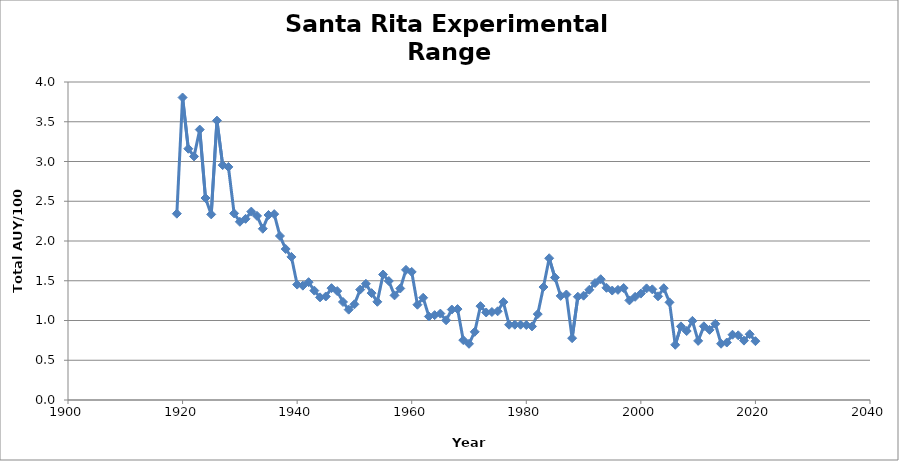
| Category | Series 0 |
|---|---|
| 1919.0 | 2.344 |
| 1920.0 | 3.805 |
| 1921.0 | 3.16 |
| 1922.0 | 3.064 |
| 1923.0 | 3.402 |
| 1924.0 | 2.541 |
| 1925.0 | 2.335 |
| 1926.0 | 3.514 |
| 1927.0 | 2.954 |
| 1928.0 | 2.932 |
| 1929.0 | 2.347 |
| 1930.0 | 2.242 |
| 1931.0 | 2.279 |
| 1932.0 | 2.37 |
| 1933.0 | 2.316 |
| 1934.0 | 2.154 |
| 1935.0 | 2.327 |
| 1936.0 | 2.338 |
| 1937.0 | 2.063 |
| 1938.0 | 1.899 |
| 1939.0 | 1.8 |
| 1940.0 | 1.452 |
| 1941.0 | 1.439 |
| 1942.0 | 1.482 |
| 1943.0 | 1.376 |
| 1944.0 | 1.291 |
| 1945.0 | 1.302 |
| 1946.0 | 1.407 |
| 1947.0 | 1.37 |
| 1948.0 | 1.233 |
| 1949.0 | 1.136 |
| 1950.0 | 1.204 |
| 1951.0 | 1.389 |
| 1952.0 | 1.462 |
| 1953.0 | 1.344 |
| 1954.0 | 1.235 |
| 1955.0 | 1.579 |
| 1956.0 | 1.497 |
| 1957.0 | 1.316 |
| 1958.0 | 1.403 |
| 1959.0 | 1.637 |
| 1960.0 | 1.611 |
| 1961.0 | 1.199 |
| 1962.0 | 1.286 |
| 1963.0 | 1.05 |
| 1964.0 | 1.067 |
| 1965.0 | 1.087 |
| 1966.0 | 1.003 |
| 1967.0 | 1.138 |
| 1968.0 | 1.144 |
| 1969.0 | 0.753 |
| 1970.0 | 0.707 |
| 1971.0 | 0.857 |
| 1972.0 | 1.181 |
| 1973.0 | 1.101 |
| 1974.0 | 1.107 |
| 1975.0 | 1.116 |
| 1976.0 | 1.231 |
| 1977.0 | 0.947 |
| 1978.0 | 0.947 |
| 1979.0 | 0.947 |
| 1980.0 | 0.943 |
| 1981.0 | 0.926 |
| 1982.0 | 1.08 |
| 1983.0 | 1.421 |
| 1984.0 | 1.783 |
| 1985.0 | 1.54 |
| 1986.0 | 1.309 |
| 1987.0 | 1.327 |
| 1988.0 | 0.778 |
| 1989.0 | 1.299 |
| 1990.0 | 1.312 |
| 1991.0 | 1.386 |
| 1992.0 | 1.471 |
| 1993.0 | 1.519 |
| 1994.0 | 1.411 |
| 1995.0 | 1.377 |
| 1996.0 | 1.385 |
| 1997.0 | 1.408 |
| 1998.0 | 1.253 |
| 1999.0 | 1.298 |
| 2000.0 | 1.338 |
| 2001.0 | 1.404 |
| 2002.0 | 1.392 |
| 2003.0 | 1.304 |
| 2004.0 | 1.406 |
| 2005.0 | 1.229 |
| 2006.0 | 0.694 |
| 2007.0 | 0.926 |
| 2008.0 | 0.868 |
| 2009.0 | 0.996 |
| 2010.0 | 0.744 |
| 2011.0 | 0.927 |
| 2012.0 | 0.882 |
| 2013.0 | 0.958 |
| 2014.0 | 0.708 |
| 2015.0 | 0.723 |
| 2016.0 | 0.821 |
| 2017.0 | 0.814 |
| 2018.0 | 0.747 |
| 2019.0 | 0.827 |
| 2020.0 | 0.74 |